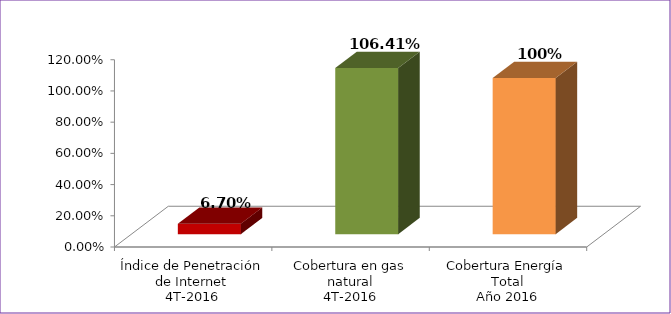
| Category | Series 0 |
|---|---|
| Índice de Penetración de Internet
4T-2016 | 0.067 |
| Cobertura en gas natural
4T-2016 | 1.064 |
| Cobertura Energía Total
Año 2016 | 1 |